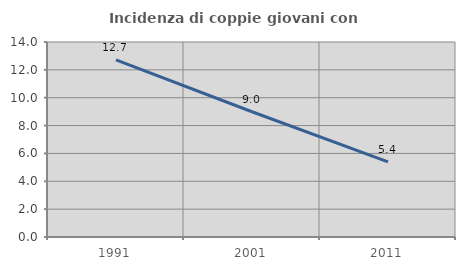
| Category | Incidenza di coppie giovani con figli |
|---|---|
| 1991.0 | 12.712 |
| 2001.0 | 8.994 |
| 2011.0 | 5.388 |